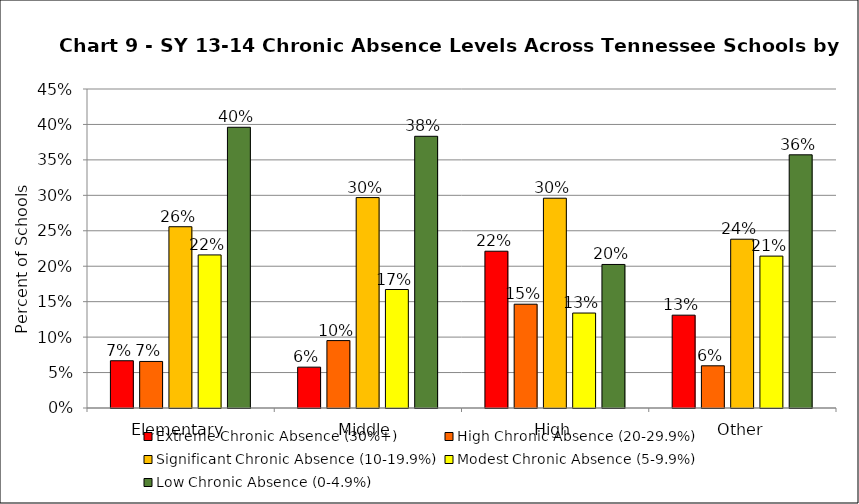
| Category | Extreme Chronic Absence (30%+) | High Chronic Absence (20-29.9%) | Significant Chronic Absence (10-19.9%) | Modest Chronic Absence (5-9.9%) | Low Chronic Absence (0-4.9%) |
|---|---|---|---|---|---|
| 0 | 0.067 | 0.066 | 0.256 | 0.216 | 0.396 |
| 1 | 0.058 | 0.095 | 0.297 | 0.167 | 0.383 |
| 2 | 0.221 | 0.146 | 0.296 | 0.134 | 0.202 |
| 3 | 0.131 | 0.06 | 0.238 | 0.214 | 0.357 |